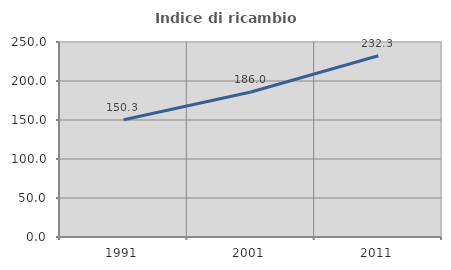
| Category | Indice di ricambio occupazionale  |
|---|---|
| 1991.0 | 150.301 |
| 2001.0 | 185.965 |
| 2011.0 | 232.331 |